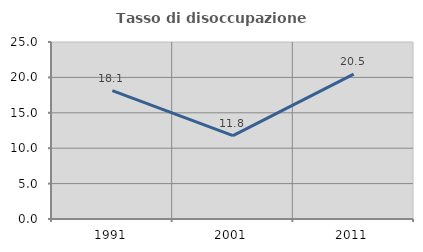
| Category | Tasso di disoccupazione giovanile  |
|---|---|
| 1991.0 | 18.137 |
| 2001.0 | 11.765 |
| 2011.0 | 20.455 |